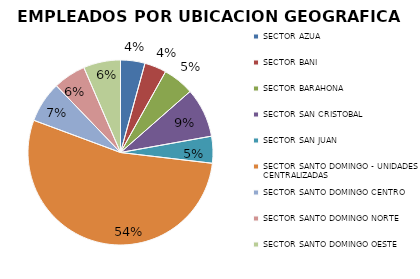
| Category | Series 0 |
|---|---|
| SECTOR AZUA | 119 |
| SECTOR BANI | 107 |
| SECTOR BARAHONA | 152 |
| SECTOR SAN CRISTOBAL | 241 |
| SECTOR SAN JUAN | 131 |
| SECTOR SANTO DOMINGO - UNIDADES CENTRALIZADAS | 1502 |
| SECTOR SANTO DOMINGO CENTRO | 200 |
| SECTOR SANTO DOMINGO NORTE | 159 |
| SECTOR SANTO DOMINGO OESTE | 181 |